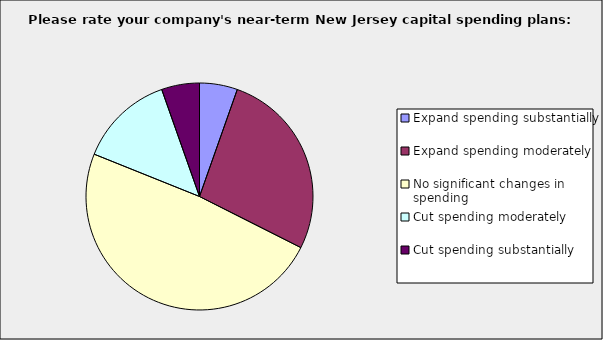
| Category | Series 0 |
|---|---|
| Expand spending substantially | 0.054 |
| Expand spending moderately | 0.27 |
| No significant changes in spending | 0.486 |
| Cut spending moderately | 0.135 |
| Cut spending substantially | 0.054 |